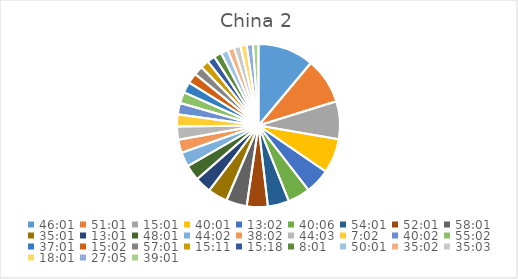
| Category | Series 0 |
|---|---|
| 1.917361111111111 | 10.657 |
| 2.1256944444444446 | 8.754 |
| 0.6256944444444444 | 7.198 |
| 1.667361111111111 | 6.588 |
| 0.5430555555555555 | 4.776 |
| 1.6708333333333334 | 4.238 |
| 2.2506944444444446 | 4.06 |
| 2.167361111111111 | 3.993 |
| 2.417361111111111 | 3.949 |
| 1.4590277777777778 | 3.749 |
| 0.5423611111111112 | 3.112 |
| 2.0006944444444446 | 2.982 |
| 1.8347222222222221 | 2.786 |
| 1.5847222222222221 | 2.526 |
| 1.8354166666666665 | 2.505 |
| 0.29305555555555557 | 2.289 |
| 1.6680555555555554 | 2.161 |
| 2.2930555555555556 | 2.139 |
| 1.542361111111111 | 2.075 |
| 0.6263888888888889 | 1.947 |
| 2.3756944444444446 | 1.755 |
| 0.6326388888888889 | 1.607 |
| 0.6375000000000001 | 1.479 |
| 0.3340277777777778 | 1.458 |
| 2.0840277777777776 | 1.353 |
| 1.4597222222222221 | 1.268 |
| 1.4604166666666665 | 1.247 |
| 0.7506944444444444 | 1.184 |
| 1.128472222222222 | 1.184 |
| 1.6256944444444443 | 1.058 |